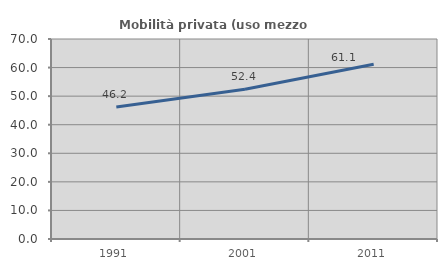
| Category | Mobilità privata (uso mezzo privato) |
|---|---|
| 1991.0 | 46.23 |
| 2001.0 | 52.381 |
| 2011.0 | 61.14 |